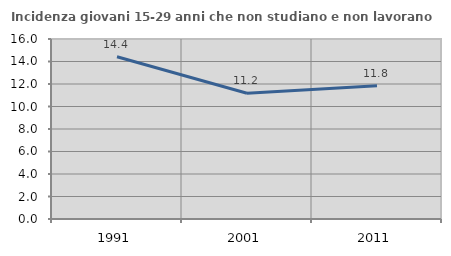
| Category | Incidenza giovani 15-29 anni che non studiano e non lavorano  |
|---|---|
| 1991.0 | 14.421 |
| 2001.0 | 11.183 |
| 2011.0 | 11.836 |